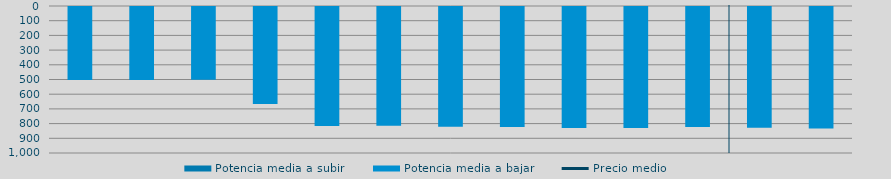
| Category | Potencia media a subir | Potencia media a bajar |
|---|---|---|
| 0 |  | 495.792 |
| 1 |  | 497.176 |
| 2 |  | 494.972 |
| 3 |  | 659.7 |
| 4 |  | 809.502 |
| 5 |  | 808.05 |
| 6 |  | 814.726 |
| 7 |  | 815.741 |
| 8 |  | 822.445 |
| 9 |  | 823.804 |
| 10 |  | 816.372 |
| 11 |  | 821.408 |
| 12 |  | 825.952 |